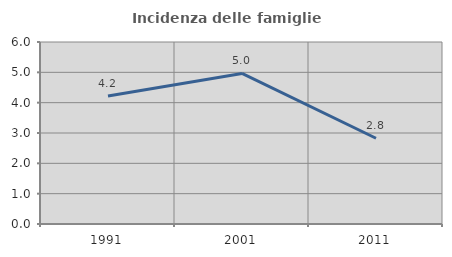
| Category | Incidenza delle famiglie numerose |
|---|---|
| 1991.0 | 4.22 |
| 2001.0 | 4.965 |
| 2011.0 | 2.827 |